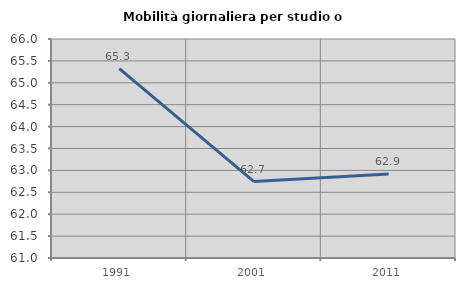
| Category | Mobilità giornaliera per studio o lavoro |
|---|---|
| 1991.0 | 65.325 |
| 2001.0 | 62.745 |
| 2011.0 | 62.919 |